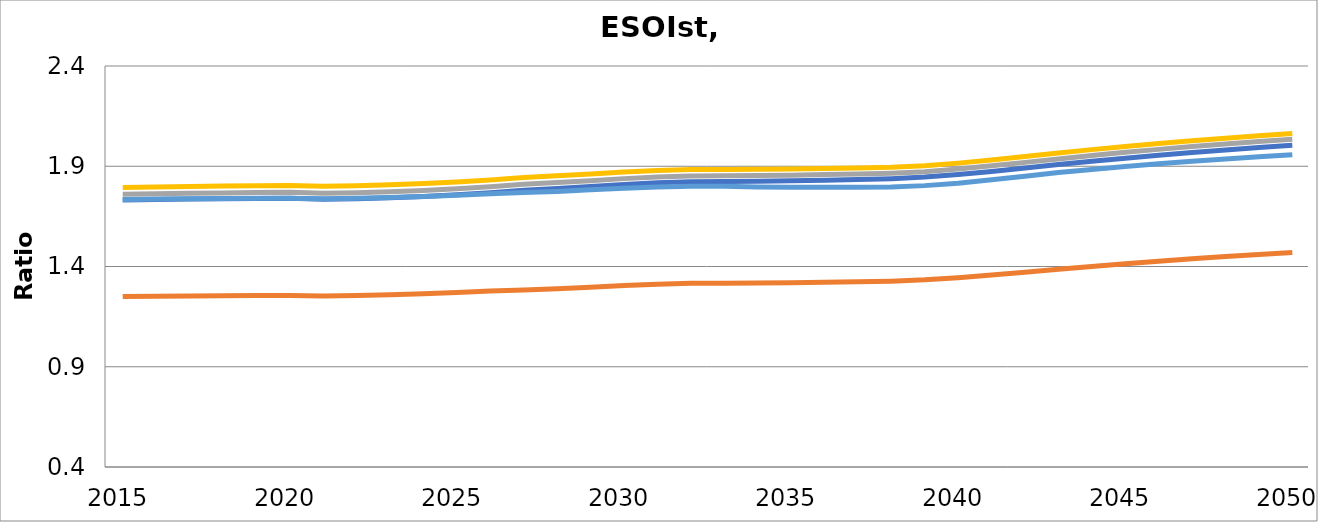
| Category |  ESOIst [LMO] |  ESOIst [NMC622] |  ESOIst [NMC811] |  ESOIst [NCA] |  ESOIst [LFP] |
|---|---|---|---|---|---|
| 2015.0 | 1.25 | 1.731 | 1.76 | 1.794 | 1.734 |
| 2016.0 | 1.252 | 1.734 | 1.763 | 1.797 | 1.736 |
| 2017.0 | 1.253 | 1.736 | 1.765 | 1.799 | 1.738 |
| 2018.0 | 1.254 | 1.738 | 1.767 | 1.802 | 1.739 |
| 2019.0 | 1.255 | 1.74 | 1.769 | 1.803 | 1.74 |
| 2020.0 | 1.255 | 1.741 | 1.77 | 1.804 | 1.741 |
| 2021.0 | 1.253 | 1.735 | 1.765 | 1.8 | 1.738 |
| 2022.0 | 1.256 | 1.738 | 1.768 | 1.803 | 1.74 |
| 2023.0 | 1.259 | 1.743 | 1.773 | 1.808 | 1.744 |
| 2024.0 | 1.264 | 1.749 | 1.779 | 1.814 | 1.749 |
| 2025.0 | 1.27 | 1.758 | 1.787 | 1.822 | 1.755 |
| 2026.0 | 1.277 | 1.768 | 1.798 | 1.832 | 1.763 |
| 2027.0 | 1.283 | 1.781 | 1.81 | 1.844 | 1.769 |
| 2028.0 | 1.289 | 1.79 | 1.819 | 1.852 | 1.775 |
| 2029.0 | 1.297 | 1.799 | 1.828 | 1.861 | 1.782 |
| 2030.0 | 1.305 | 1.809 | 1.838 | 1.871 | 1.79 |
| 2031.0 | 1.311 | 1.818 | 1.847 | 1.879 | 1.797 |
| 2032.0 | 1.316 | 1.822 | 1.851 | 1.884 | 1.8 |
| 2033.0 | 1.317 | 1.824 | 1.852 | 1.884 | 1.8 |
| 2034.0 | 1.318 | 1.825 | 1.853 | 1.885 | 1.797 |
| 2035.0 | 1.32 | 1.828 | 1.856 | 1.887 | 1.795 |
| 2036.0 | 1.322 | 1.831 | 1.858 | 1.889 | 1.795 |
| 2037.0 | 1.324 | 1.834 | 1.861 | 1.891 | 1.795 |
| 2038.0 | 1.327 | 1.838 | 1.865 | 1.895 | 1.797 |
| 2039.0 | 1.333 | 1.846 | 1.873 | 1.903 | 1.803 |
| 2040.0 | 1.344 | 1.859 | 1.886 | 1.916 | 1.816 |
| 2041.0 | 1.357 | 1.874 | 1.902 | 1.932 | 1.832 |
| 2042.0 | 1.372 | 1.891 | 1.919 | 1.949 | 1.851 |
| 2043.0 | 1.386 | 1.908 | 1.937 | 1.966 | 1.869 |
| 2044.0 | 1.4 | 1.925 | 1.954 | 1.983 | 1.884 |
| 2045.0 | 1.414 | 1.94 | 1.969 | 1.999 | 1.899 |
| 2046.0 | 1.427 | 1.955 | 1.984 | 2.013 | 1.912 |
| 2047.0 | 1.438 | 1.969 | 1.998 | 2.027 | 1.925 |
| 2048.0 | 1.45 | 1.981 | 2.011 | 2.04 | 1.937 |
| 2049.0 | 1.46 | 1.993 | 2.023 | 2.052 | 1.948 |
| 2050.0 | 1.47 | 2.005 | 2.035 | 2.063 | 1.958 |